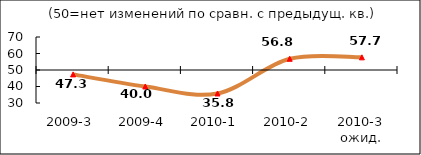
| Category | Диф.индекс ↓ |
|---|---|
| 2009-3 | 47.335 |
| 2009-4 | 40.005 |
| 2010-1 | 35.765 |
| 2010-2 | 56.79 |
| 2010-3 ожид. | 57.675 |